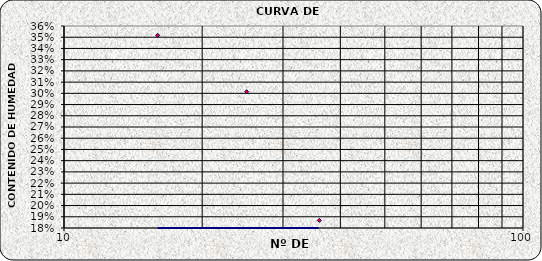
| Category | Series 0 |
|---|---|
| 36.0 | 0.187 |
| 25.0 | 0.301 |
| 16.0 | 0.352 |